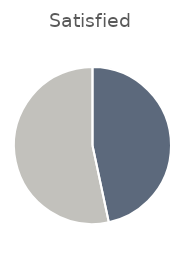
| Category | Total |
|---|---|
| 0 | 42 |
| 1 | 48 |